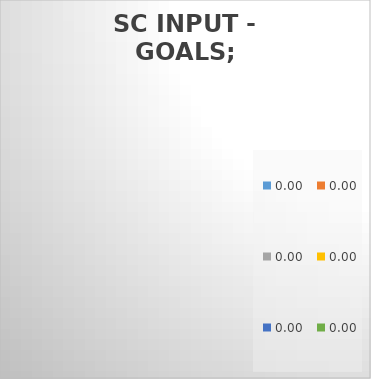
| Category | Goals |
|---|---|
| 0.0 | 0 |
| 0.0 | 0 |
| 0.0 | 0 |
| 0.0 | 0 |
| 0.0 | 0 |
| 0.0 | 0 |